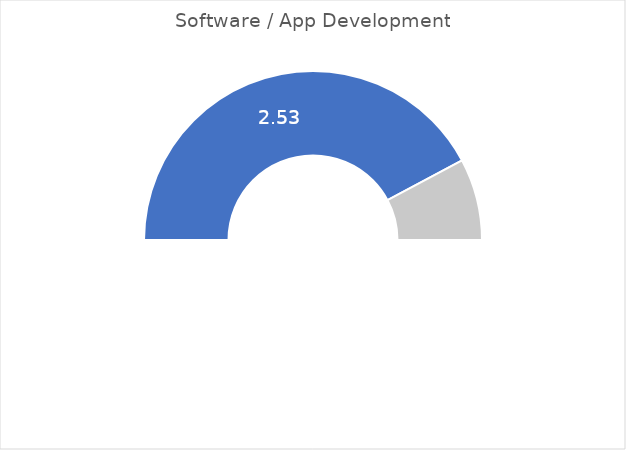
| Category | Series 0 |
|---|---|
| 0 | 0.844 |
| 1 | 0.156 |
| 2 | 1 |